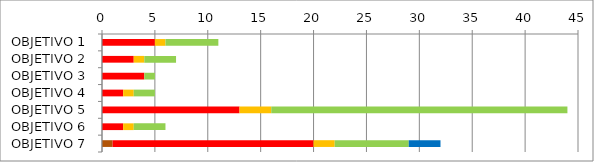
| Category | Series 0 | Series 1 | Series 2 | Series 3 | Series 4 | Series 5 |
|---|---|---|---|---|---|---|
| OBJETIVO 1 | 0 | 0 | 5 | 1 | 5 | 0 |
| OBJETIVO 2 | 0 | 0 | 3 | 1 | 3 | 0 |
| OBJETIVO 3 | 0 | 0 | 4 | 0 | 1 | 0 |
| OBJETIVO 4 | 0 | 0 | 2 | 1 | 2 | 0 |
| OBJETIVO 5 | 0 | 0 | 13 | 3 | 28 | 0 |
| OBJETIVO 6 | 0 | 0 | 2 | 1 | 3 | 0 |
| OBJETIVO 7 | 1 | 0 | 19 | 2 | 7 | 3 |